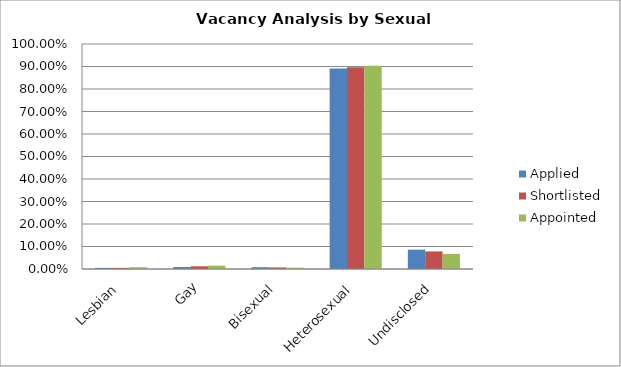
| Category | Applied | Shortlisted | Appointed |
|---|---|---|---|
| Lesbian | 0.005 | 0.005 | 0.008 |
| Gay | 0.009 | 0.012 | 0.015 |
| Bisexual | 0.008 | 0.007 | 0.006 |
| Heterosexual | 0.891 | 0.897 | 0.903 |
| Undisclosed | 0.086 | 0.078 | 0.067 |